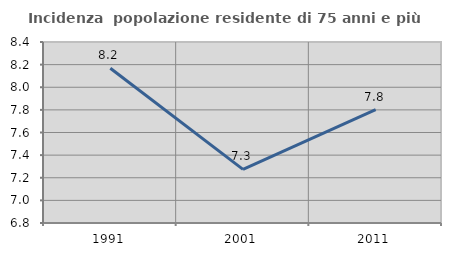
| Category | Incidenza  popolazione residente di 75 anni e più |
|---|---|
| 1991.0 | 8.169 |
| 2001.0 | 7.274 |
| 2011.0 | 7.803 |